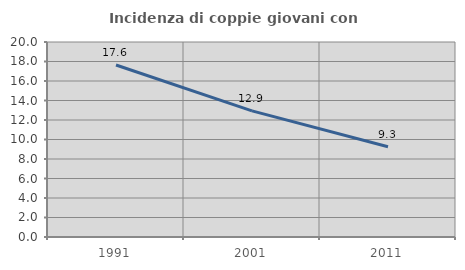
| Category | Incidenza di coppie giovani con figli |
|---|---|
| 1991.0 | 17.642 |
| 2001.0 | 12.933 |
| 2011.0 | 9.258 |